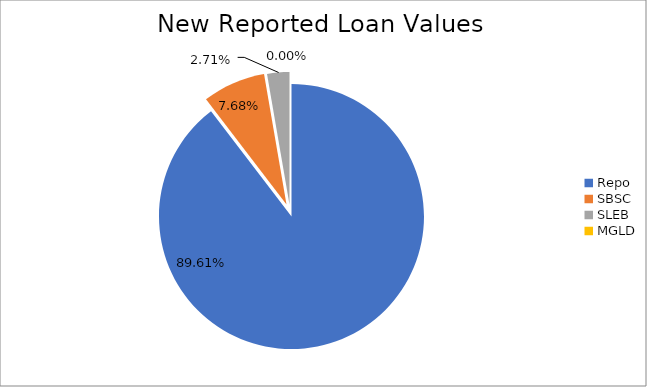
| Category | Series 0 |
|---|---|
| Repo | 10519765.121 |
| SBSC | 901259.027 |
| SLEB | 318282.261 |
| MGLD | 164.862 |